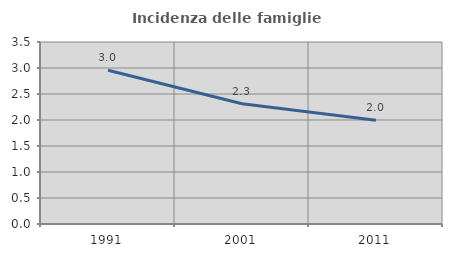
| Category | Incidenza delle famiglie numerose |
|---|---|
| 1991.0 | 2.957 |
| 2001.0 | 2.313 |
| 2011.0 | 1.996 |